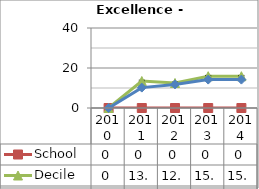
| Category | School  | Decile | National |
|---|---|---|---|
| 2010.0 | 0 | 0 | 0 |
| 2011.0 | 0 | 13.5 | 10.2 |
| 2012.0 | 0 | 12.5 | 11.8 |
| 2013.0 | 0 | 15.9 | 14.2 |
| 2014.0 | 0 | 15.9 | 14.2 |